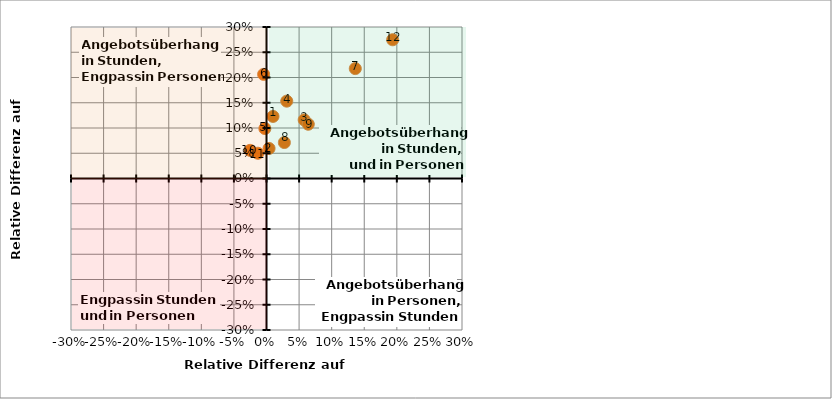
| Category | Series 5 |
|---|---|
| 0.009964019563466486 | 0.123 |
| 0.003927244598099788 | 0.06 |
| 0.05786038638057489 | 0.116 |
| 0.031071922720444123 | 0.153 |
| -0.002509684408837365 | 0.099 |
| -0.004440875618497486 | 0.206 |
| 0.13627217766102584 | 0.218 |
| 0.027440808800080374 | 0.071 |
| 0.06410287764926981 | 0.107 |
| -0.025061595426220884 | 0.056 |
| -0.013299469631492644 | 0.05 |
| 0.1935616314300428 | 0.275 |